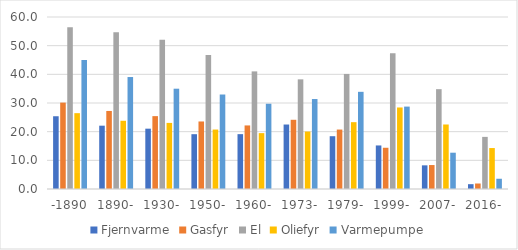
| Category | Fjernvarme | Gasfyr | El | Oliefyr | Varmepumpe |
|---|---|---|---|---|---|
| -1890 | 25.38 | 30.14 | 56.448 | 26.453 | 44.99 |
| 1890- | 22.086 | 27.223 | 54.646 | 23.803 | 39.06 |
| 1930- | 21.044 | 25.421 | 52.033 | 23.057 | 34.988 |
| 1950- | 19.12 | 23.556 | 46.708 | 20.741 | 32.962 |
| 1960- | 19.135 | 22.173 | 41.025 | 19.49 | 29.745 |
| 1973- | 22.494 | 24.144 | 38.252 | 20.051 | 31.384 |
| 1979- | 18.417 | 20.738 | 40.133 | 23.311 | 33.898 |
| 1999- | 15.191 | 14.387 | 47.331 | 28.436 | 28.746 |
| 2007- | 8.251 | 8.357 | 34.828 | 22.502 | 12.662 |
| 2016- | 1.683 | 1.916 | 18.182 | 14.286 | 3.574 |